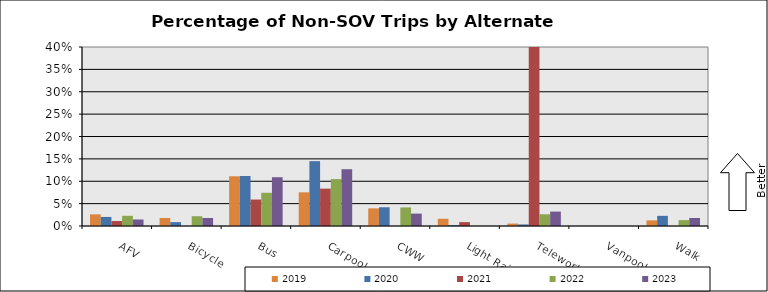
| Category | 2019 | 2020 | 2021 | 2022 | 2023 |
|---|---|---|---|---|---|
| AFV | 0.026 | 0.02 | 0.011 | 0.023 | 0.015 |
| Bicycle | 0.018 | 0.009 | 0 | 0.022 | 0.018 |
| Bus | 0.111 | 0.112 | 0.059 | 0.074 | 0.109 |
| Carpool | 0.075 | 0.145 | 0.083 | 0.105 | 0.127 |
| CWW | 0.039 | 0.042 | 0 | 0.041 | 0.028 |
| Light Rail | 0.016 | 0.002 | 0.009 | 0 | 0 |
| Telework | 0.005 | 0.003 | 0.523 | 0.026 | 0.032 |
| Vanpool | 0 | 0 | 0 | 0 | 0 |
| Walk | 0.013 | 0.023 | 0 | 0.013 | 0.018 |